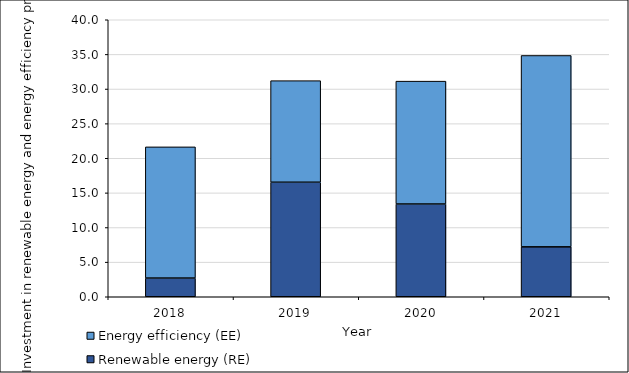
| Category | Renewable energy (RE) | Energy efficiency (EE) |
|---|---|---|
| 2018.0 | 2.7 | 18.944 |
| 2019.0 | 16.537 | 14.668 |
| 2020.0 | 13.395 | 17.741 |
| 2021.0 | 7.209 | 27.635 |